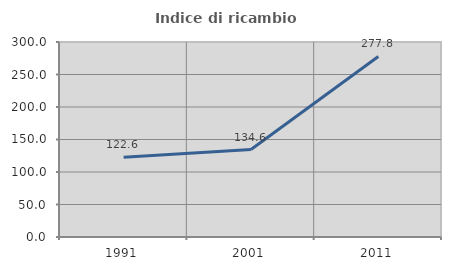
| Category | Indice di ricambio occupazionale  |
|---|---|
| 1991.0 | 122.581 |
| 2001.0 | 134.615 |
| 2011.0 | 277.778 |